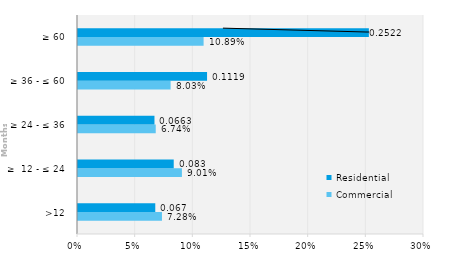
| Category | Commercial | Residential |
|---|---|---|
| >12 | 0.073 | 0.067 |
| ≥  12 - ≤ 24 | 0.09 | 0.083 |
| ≥ 24 - ≤ 36 | 0.067 | 0.066 |
| ≥ 36 - ≤ 60 | 0.08 | 0.112 |
| ≥ 60 | 0.109 | 0.252 |